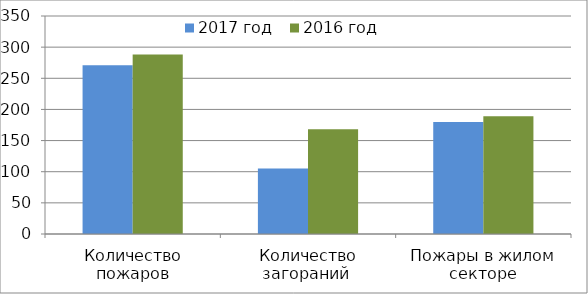
| Category | 2017 год | 2016 год |
|---|---|---|
| Количество пожаров | 271 | 288 |
| Количество загораний  | 105 | 168 |
| Пожары в жилом секторе | 180 | 189 |